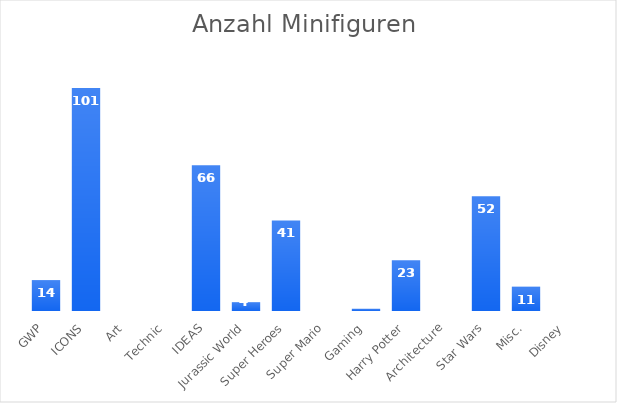
| Category | Preis/Teil im Schnitt |
|---|---|
| GWP | 0 |
| ICONS | 8.259 |
| Art | 3.785 |
| Technic | 11.78 |
| IDEAS | 9.188 |
| Jurassic World | 8.25 |
| Super Heroes | 12.147 |
| Super Mario | 9.837 |
| Gaming | 7.364 |
| Harry Potter | 9.857 |
| Architecture | 7.354 |
| Star Wars | 10.666 |
| Misc. | 10.113 |
| Disney | 10.35 |